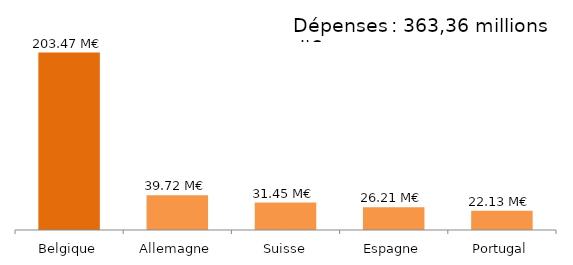
| Category | Series 0 |
|---|---|
| Belgique | 203472624.97 |
| Allemagne | 39722204.338 |
| Suisse | 31445584.461 |
| Espagne | 26206352.61 |
| Portugal | 22129684.56 |